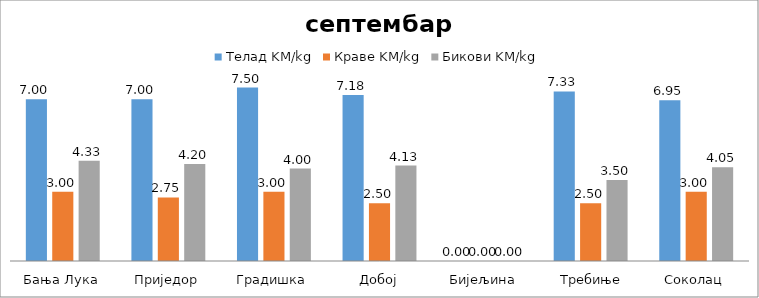
| Category | Телад KM/kg | Краве KM/kg | Бикови KM/kg |
|---|---|---|---|
| Бања Лука | 7 | 3 | 4.333 |
| Приједор | 7 | 2.75 | 4.2 |
| Градишка | 7.5 | 3 | 4 |
| Добој | 7.175 | 2.5 | 4.125 |
| Бијељина | 0 | 0 | 0 |
|  Требиње | 7.333 | 2.5 | 3.5 |
| Соколац | 6.95 | 3 | 4.05 |